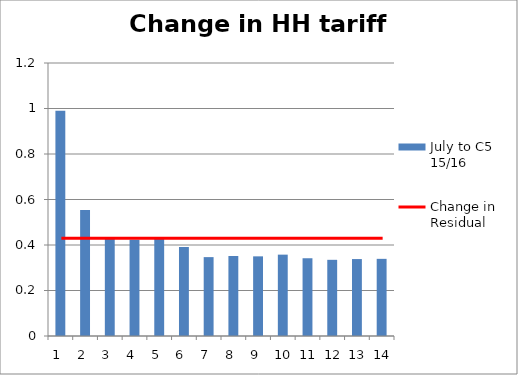
| Category | July to C5 15/16 |
|---|---|
| 1.0 | 0.99 |
| 2.0 | 0.554 |
| 3.0 | 0.433 |
| 4.0 | 0.423 |
| 5.0 | 0.429 |
| 6.0 | 0.391 |
| 7.0 | 0.347 |
| 8.0 | 0.352 |
| 9.0 | 0.35 |
| 10.0 | 0.358 |
| 11.0 | 0.342 |
| 12.0 | 0.335 |
| 13.0 | 0.338 |
| 14.0 | 0.339 |